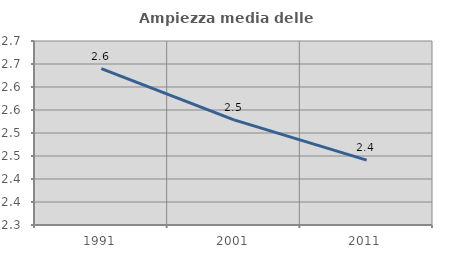
| Category | Ampiezza media delle famiglie |
|---|---|
| 1991.0 | 2.64 |
| 2001.0 | 2.529 |
| 2011.0 | 2.441 |